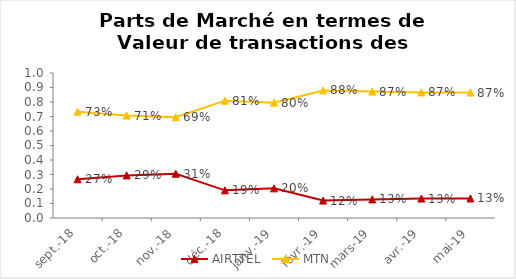
| Category | AIRTTEL | MTN |
|---|---|---|
| sept.-18 | 0.267 | 0.733 |
| oct.-18 | 0.294 | 0.706 |
| nov.-18 | 0.305 | 0.695 |
| déc.-18 | 0.191 | 0.809 |
| janv.-19 | 0.204 | 0.796 |
| févr.-19 | 0.12 | 0.88 |
| mars-19 | 0.128 | 0.872 |
| avr.-19 | 0.134 | 0.866 |
| mai-19 | 0.135 | 0.865 |